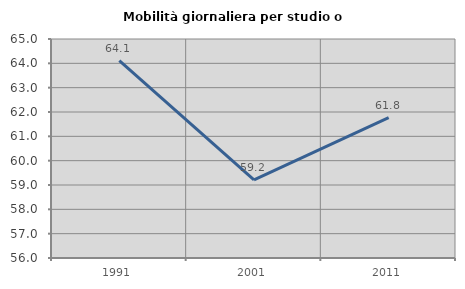
| Category | Mobilità giornaliera per studio o lavoro |
|---|---|
| 1991.0 | 64.113 |
| 2001.0 | 59.207 |
| 2011.0 | 61.768 |